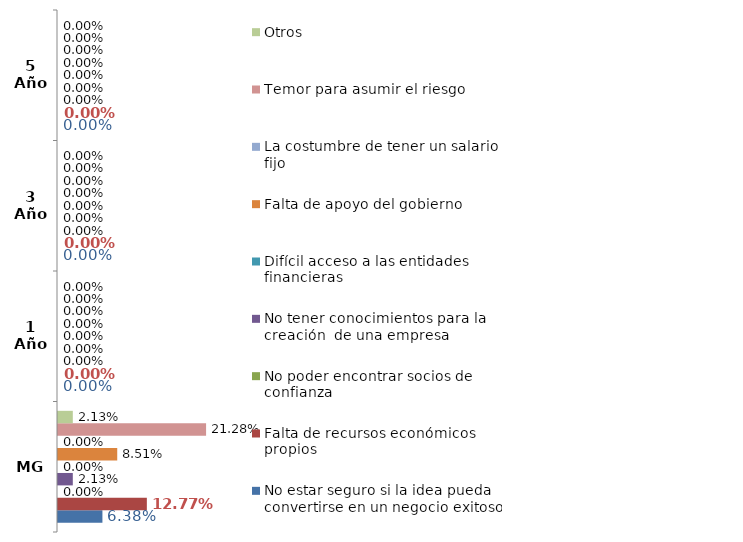
| Category | No estar seguro si la idea pueda  convertirse en un negocio exitoso | Falta de recursos económicos propios  | No poder encontrar socios de confianza  | No tener conocimientos para la creación  de una empresa  | Difícil acceso a las entidades financieras  | Falta de apoyo del gobierno | La costumbre de tener un salario fijo  | Temor para asumir el riesgo | Otros |
|---|---|---|---|---|---|---|---|---|---|
| MG | 0.064 | 0.128 | 0 | 0.021 | 0 | 0.085 | 0 | 0.213 | 0.021 |
| 1 Año | 0 | 0 | 0 | 0 | 0 | 0 | 0 | 0 | 0 |
| 3 Año | 0 | 0 | 0 | 0 | 0 | 0 | 0 | 0 | 0 |
| 5 Año | 0 | 0 | 0 | 0 | 0 | 0 | 0 | 0 | 0 |